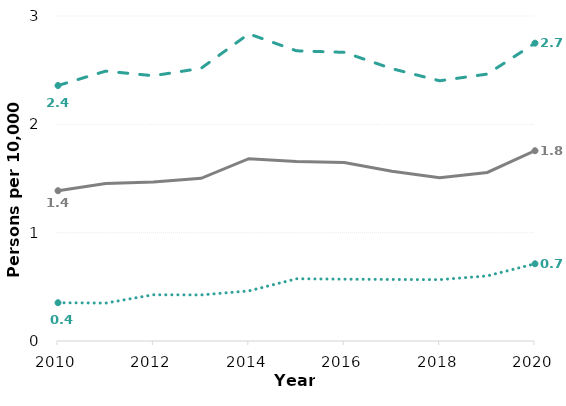
| Category | Persons | Females | Males |
|---|---|---|---|
| 2010.0 | 1.387 | 2.358 | 0.353 |
| 2011.0 | 1.453 | 2.491 | 0.35 |
| 2012.0 | 1.468 | 2.449 | 0.427 |
| 2013.0 | 1.502 | 2.517 | 0.425 |
| 2014.0 | 1.683 | 2.835 | 0.462 |
| 2015.0 | 1.656 | 2.679 | 0.575 |
| 2016.0 | 1.647 | 2.665 | 0.571 |
| 2017.0 | 1.567 | 2.514 | 0.568 |
| 2018.0 | 1.508 | 2.402 | 0.566 |
| 2019.0 | 1.556 | 2.464 | 0.601 |
| 2020.0 | 1.756 | 2.749 | 0.713 |